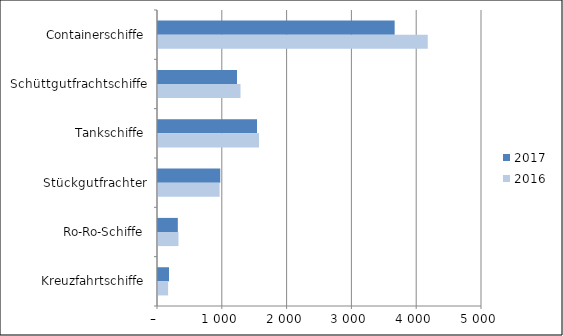
| Category | 2017 | 2016 |
|---|---|---|
| Containerschiffe | 3652 | 4163 |
| Schüttgutfrachtschiffe | 1219 | 1273 |
| Tankschiffe | 1528 | 1559 |
| Stückgutfrachter | 961 | 951 |
| Ro-Ro-Schiffe | 306 | 316 |
| Kreuzfahrtschiffe | 170 | 156 |